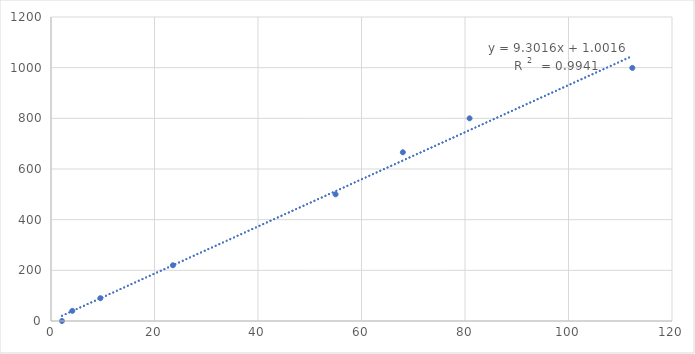
| Category | Concentration (microgram/mL) |
|---|---|
| 2.12 | 0 |
| 9.54 | 90 |
| 23.56 | 220 |
| 54.99 | 500 |
| 80.88 | 800 |
| 112.33 | 999 |
| 67.99 | 666 |
| 4.12 | 40 |